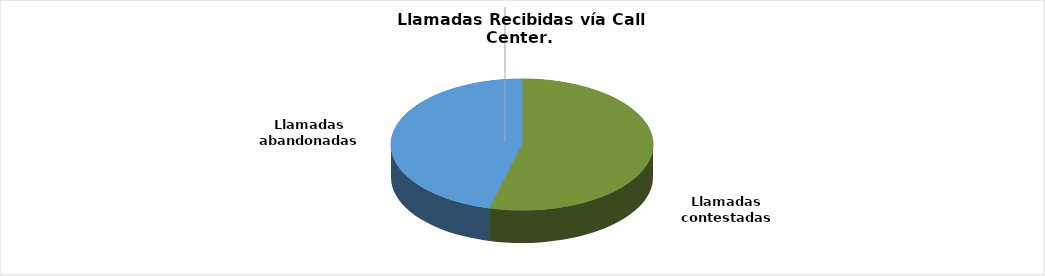
| Category | Enero-Diciembre |
|---|---|
| Llamadas contestadas | 139578 |
| Llamadas abandonadas | 118936 |